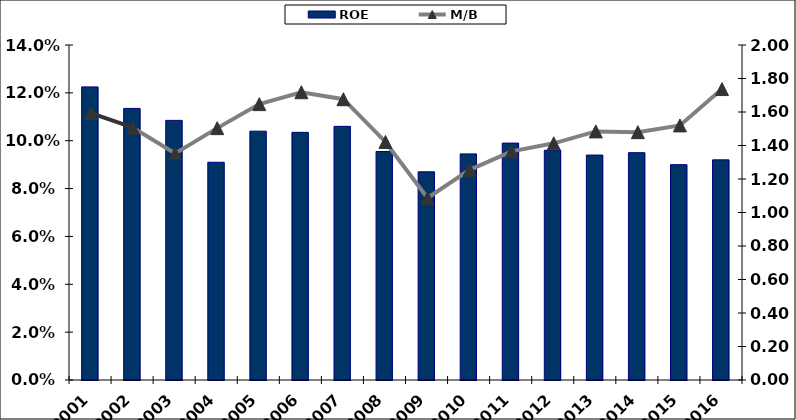
| Category | ROE |
|---|---|
| 2001.0 | 0.122 |
| 2002.0 | 0.114 |
| 2003.0 | 0.108 |
| 2004.0 | 0.091 |
| 2005.0 | 0.104 |
| 2006.0 | 0.104 |
| 2007.0 | 0.106 |
| 2008.0 | 0.096 |
| 2009.0 | 0.087 |
| 2010.0 | 0.094 |
| 2011.0 | 0.099 |
| 2012.0 | 0.096 |
| 2013.0 | 0.094 |
| 2014.0 | 0.095 |
| 2015.0 | 0.09 |
| 2016.0 | 0.092 |